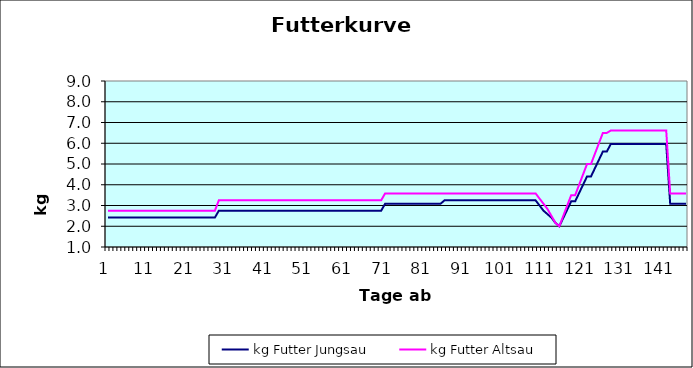
| Category | kg Futter Jungsau | kg Futter Altsau |
|---|---|---|
| 0 | 2.417 | 2.75 |
| 1 | 2.417 | 2.75 |
| 2 | 2.417 | 2.75 |
| 3 | 2.417 | 2.75 |
| 4 | 2.417 | 2.75 |
| 5 | 2.417 | 2.75 |
| 6 | 2.417 | 2.75 |
| 7 | 2.417 | 2.75 |
| 8 | 2.417 | 2.75 |
| 9 | 2.417 | 2.75 |
| 10 | 2.417 | 2.75 |
| 11 | 2.417 | 2.75 |
| 12 | 2.417 | 2.75 |
| 13 | 2.417 | 2.75 |
| 14 | 2.417 | 2.75 |
| 15 | 2.417 | 2.75 |
| 16 | 2.417 | 2.75 |
| 17 | 2.417 | 2.75 |
| 18 | 2.417 | 2.75 |
| 19 | 2.417 | 2.75 |
| 20 | 2.417 | 2.75 |
| 21 | 2.417 | 2.75 |
| 22 | 2.417 | 2.75 |
| 23 | 2.417 | 2.75 |
| 24 | 2.417 | 2.75 |
| 25 | 2.417 | 2.75 |
| 26 | 2.417 | 2.75 |
| 27 | 2.417 | 2.75 |
| 28 | 2.75 | 3.25 |
| 29 | 2.75 | 3.25 |
| 30 | 2.75 | 3.25 |
| 31 | 2.75 | 3.25 |
| 32 | 2.75 | 3.25 |
| 33 | 2.75 | 3.25 |
| 34 | 2.75 | 3.25 |
| 35 | 2.75 | 3.25 |
| 36 | 2.75 | 3.25 |
| 37 | 2.75 | 3.25 |
| 38 | 2.75 | 3.25 |
| 39 | 2.75 | 3.25 |
| 40 | 2.75 | 3.25 |
| 41 | 2.75 | 3.25 |
| 42 | 2.75 | 3.25 |
| 43 | 2.75 | 3.25 |
| 44 | 2.75 | 3.25 |
| 45 | 2.75 | 3.25 |
| 46 | 2.75 | 3.25 |
| 47 | 2.75 | 3.25 |
| 48 | 2.75 | 3.25 |
| 49 | 2.75 | 3.25 |
| 50 | 2.75 | 3.25 |
| 51 | 2.75 | 3.25 |
| 52 | 2.75 | 3.25 |
| 53 | 2.75 | 3.25 |
| 54 | 2.75 | 3.25 |
| 55 | 2.75 | 3.25 |
| 56 | 2.75 | 3.25 |
| 57 | 2.75 | 3.25 |
| 58 | 2.75 | 3.25 |
| 59 | 2.75 | 3.25 |
| 60 | 2.75 | 3.25 |
| 61 | 2.75 | 3.25 |
| 62 | 2.75 | 3.25 |
| 63 | 2.75 | 3.25 |
| 64 | 2.75 | 3.25 |
| 65 | 2.75 | 3.25 |
| 66 | 2.75 | 3.25 |
| 67 | 2.75 | 3.25 |
| 68 | 2.75 | 3.25 |
| 69 | 2.75 | 3.25 |
| 70 | 3.083 | 3.583 |
| 71 | 3.083 | 3.583 |
| 72 | 3.083 | 3.583 |
| 73 | 3.083 | 3.583 |
| 74 | 3.083 | 3.583 |
| 75 | 3.083 | 3.583 |
| 76 | 3.083 | 3.583 |
| 77 | 3.083 | 3.583 |
| 78 | 3.083 | 3.583 |
| 79 | 3.083 | 3.583 |
| 80 | 3.083 | 3.583 |
| 81 | 3.083 | 3.583 |
| 82 | 3.083 | 3.583 |
| 83 | 3.083 | 3.583 |
| 84 | 3.083 | 3.583 |
| 85 | 3.25 | 3.583 |
| 86 | 3.25 | 3.583 |
| 87 | 3.25 | 3.583 |
| 88 | 3.25 | 3.583 |
| 89 | 3.25 | 3.583 |
| 90 | 3.25 | 3.583 |
| 91 | 3.25 | 3.583 |
| 92 | 3.25 | 3.583 |
| 93 | 3.25 | 3.583 |
| 94 | 3.25 | 3.583 |
| 95 | 3.25 | 3.583 |
| 96 | 3.25 | 3.583 |
| 97 | 3.25 | 3.583 |
| 98 | 3.25 | 3.583 |
| 99 | 3.25 | 3.583 |
| 100 | 3.25 | 3.583 |
| 101 | 3.25 | 3.583 |
| 102 | 3.25 | 3.583 |
| 103 | 3.25 | 3.583 |
| 104 | 3.25 | 3.583 |
| 105 | 3.25 | 3.583 |
| 106 | 3.25 | 3.583 |
| 107 | 3.25 | 3.583 |
| 108 | 3.25 | 3.583 |
| 109 | 3 | 3.333 |
| 110 | 2.75 | 3.083 |
| 111 | 2.583 | 2.833 |
| 112 | 2.417 | 2.5 |
| 113 | 2.167 | 2.167 |
| 114 | 2 | 2 |
| 115 | 2.4 | 2.5 |
| 116 | 2.8 | 3 |
| 117 | 3.2 | 3.5 |
| 118 | 3.2 | 3.5 |
| 119 | 3.6 | 4 |
| 120 | 4 | 4.5 |
| 121 | 4.4 | 5 |
| 122 | 4.4 | 5 |
| 123 | 4.8 | 5.5 |
| 124 | 5.2 | 6 |
| 125 | 5.6 | 6.5 |
| 126 | 5.6 | 6.5 |
| 127 | 5.962 | 6.612 |
| 128 | 5.962 | 6.612 |
| 129 | 5.962 | 6.612 |
| 130 | 5.962 | 6.612 |
| 131 | 5.962 | 6.612 |
| 132 | 5.962 | 6.612 |
| 133 | 5.962 | 6.612 |
| 134 | 5.962 | 6.612 |
| 135 | 5.962 | 6.612 |
| 136 | 5.962 | 6.612 |
| 137 | 5.962 | 6.612 |
| 138 | 5.962 | 6.612 |
| 139 | 5.962 | 6.612 |
| 140 | 5.962 | 6.612 |
| 141 | 5.962 | 6.612 |
| 142 | 3.083 | 3.583 |
| 143 | 3.083 | 3.583 |
| 144 | 3.083 | 3.583 |
| 145 | 3.083 | 3.583 |
| 146 | 3.083 | 3.583 |